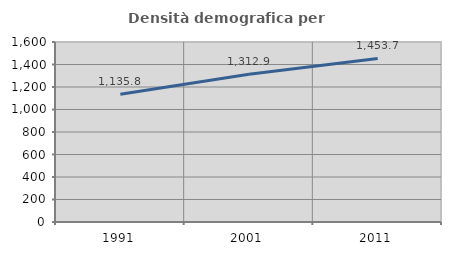
| Category | Densità demografica |
|---|---|
| 1991.0 | 1135.848 |
| 2001.0 | 1312.945 |
| 2011.0 | 1453.668 |